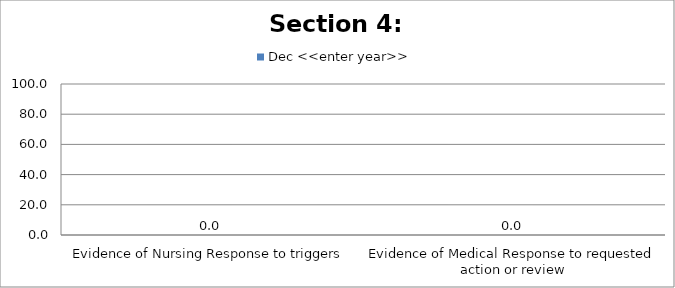
| Category | Dec <<enter year>> |
|---|---|
| Evidence of Nursing Response to triggers | 0 |
| Evidence of Medical Response to requested action or review | 0 |